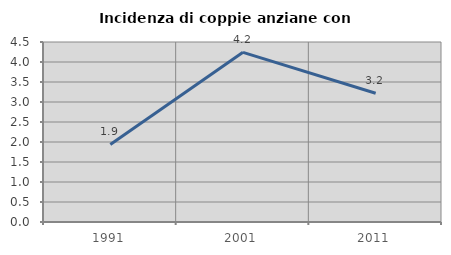
| Category | Incidenza di coppie anziane con figli |
|---|---|
| 1991.0 | 1.938 |
| 2001.0 | 4.241 |
| 2011.0 | 3.218 |